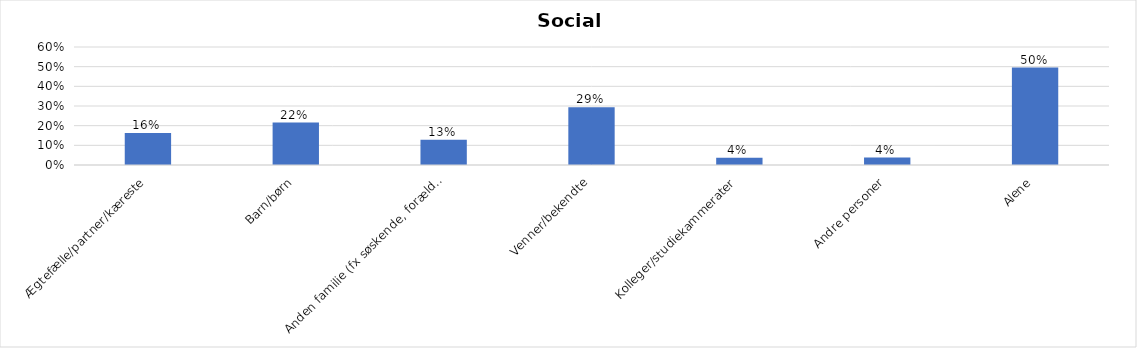
| Category | % |
|---|---|
| Ægtefælle/partner/kæreste | 0.162 |
| Barn/børn | 0.216 |
| Anden familie (fx søskende, forældre) | 0.128 |
| Venner/bekendte | 0.293 |
| Kolleger/studiekammerater | 0.036 |
| Andre personer | 0.038 |
| Alene | 0.495 |